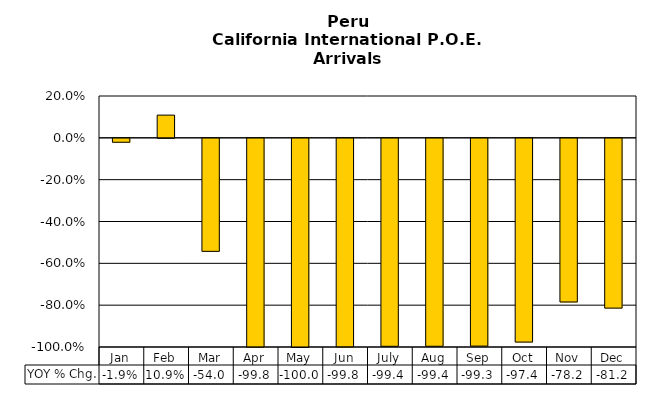
| Category | YOY % Chg. |
|---|---|
| Jan | -0.019 |
| Feb | 0.109 |
| Mar | -0.54 |
| Apr | -0.998 |
| May | -1 |
| Jun | -0.998 |
| July | -0.994 |
| Aug | -0.994 |
| Sep | -0.993 |
| Oct | -0.974 |
| Nov | -0.782 |
| Dec | -0.812 |